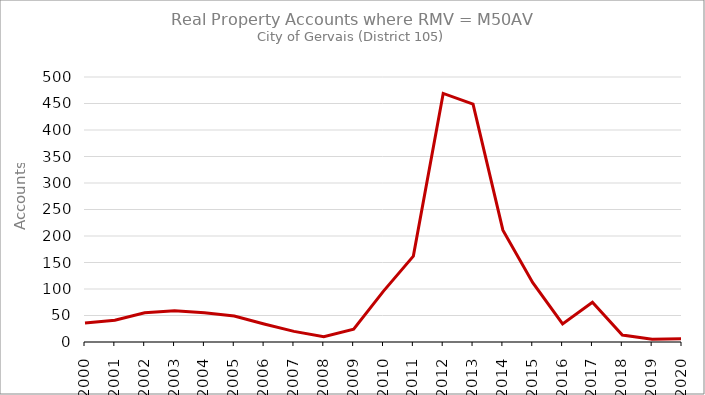
| Category | Series 0 |
|---|---|
| 2000.0 | 36 |
| 2001.0 | 41 |
| 2002.0 | 55 |
| 2003.0 | 59 |
| 2004.0 | 55 |
| 2005.0 | 49 |
| 2006.0 | 34 |
| 2007.0 | 20 |
| 2008.0 | 10 |
| 2009.0 | 24 |
| 2010.0 | 96 |
| 2011.0 | 162 |
| 2012.0 | 469 |
| 2013.0 | 449 |
| 2014.0 | 211 |
| 2015.0 | 112 |
| 2016.0 | 34 |
| 2017.0 | 75 |
| 2018.0 | 13 |
| 2019.0 | 5 |
| 2020.0 | 6 |